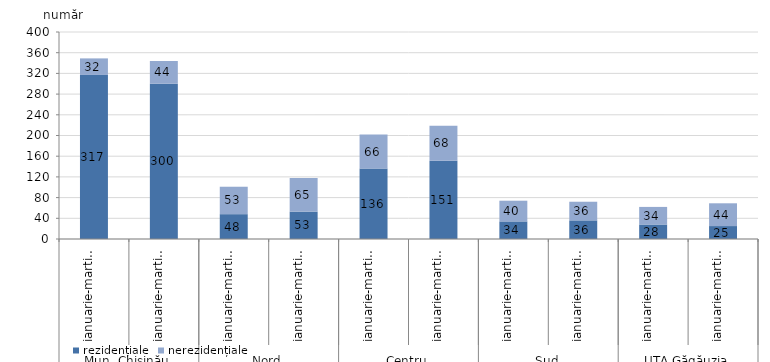
| Category | rezidențiale | nerezidențiale |
|---|---|---|
| 0 | 317 | 32 |
| 1 | 300 | 44 |
| 2 | 48 | 53 |
| 3 | 53 | 65 |
| 4 | 136 | 66 |
| 5 | 151 | 68 |
| 6 | 34 | 40 |
| 7 | 36 | 36 |
| 8 | 28 | 34 |
| 9 | 25 | 44 |